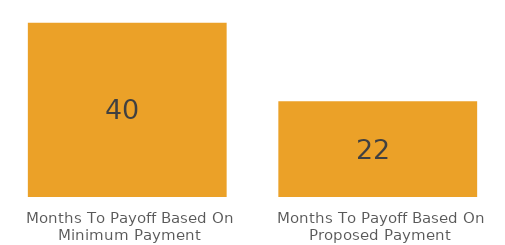
| Category | Series 0 |
|---|---|
| Months To Payoff Based On Minimum Payment | 40 |
| Months To Payoff Based On Proposed Payment | 22 |